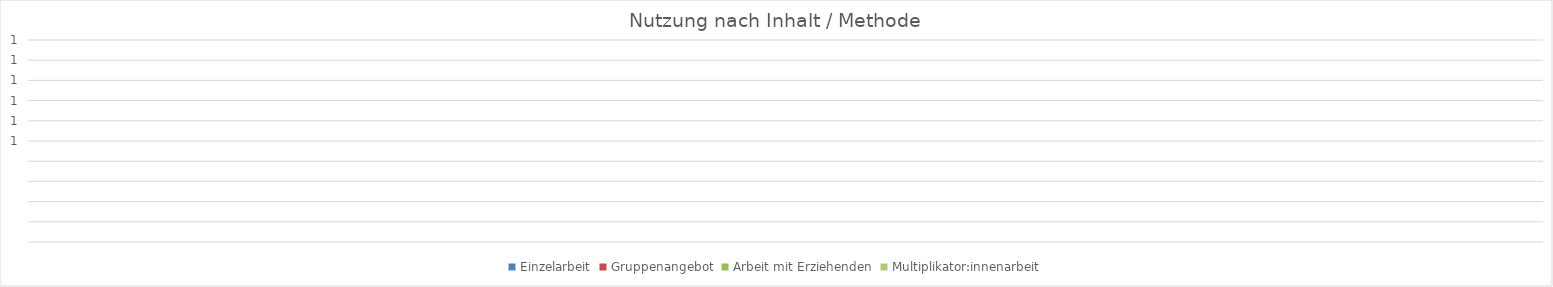
| Category | Einzelarbeit | Gruppenangebot | Arbeit mit Erziehenden | Multiplikator:innenarbeit |
|---|---|---|---|---|
| 0 | 0 | 0 | 0 | 0 |